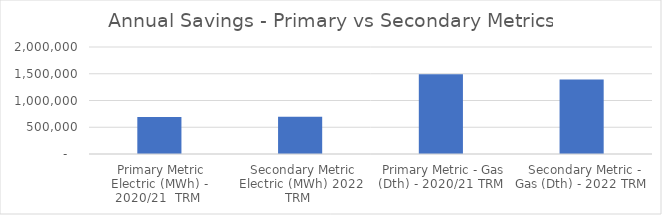
| Category | Series 0 |
|---|---|
| Primary Metric Electric (MWh) - 2020/21  TRM | 692361.702 |
| Secondary Metric Electric (MWh) 2022 TRM | 697971.545 |
| Primary Metric - Gas (Dth) - 2020/21 TRM | 1492019.978 |
| Secondary Metric - Gas (Dth) - 2022 TRM | 1393754.04 |